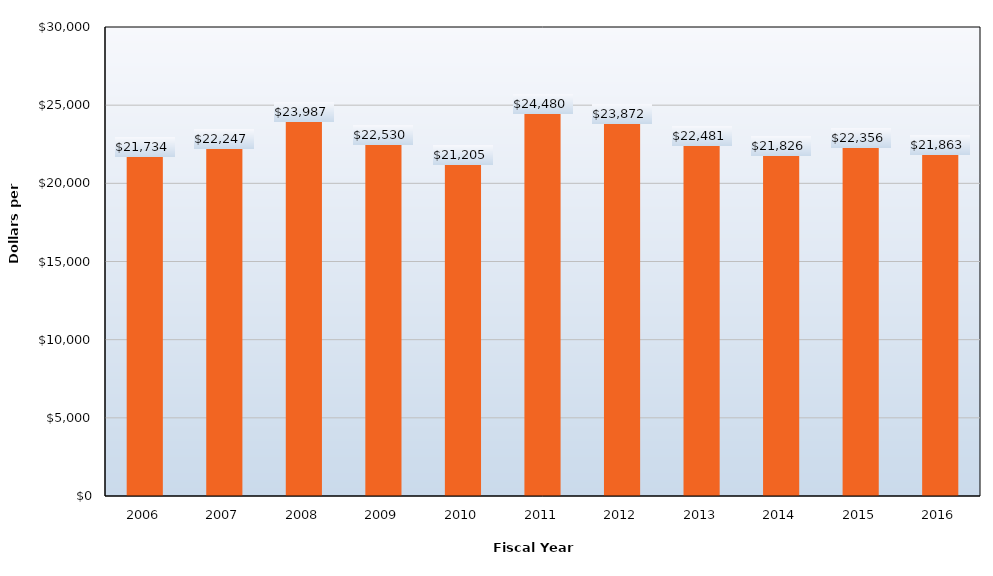
| Category | Series 1 |
|---|---|
| 2006.0 | 21734 |
| 2007.0 | 22247 |
| 2008.0 | 23987 |
| 2009.0 | 22530 |
| 2010.0 | 21205 |
| 2011.0 | 24480 |
| 2012.0 | 23872 |
| 2013.0 | 22481 |
| 2014.0 | 21826 |
| 2015.0 | 22356 |
| 2016.0 | 21863 |